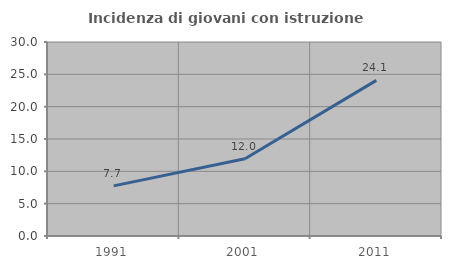
| Category | Incidenza di giovani con istruzione universitaria |
|---|---|
| 1991.0 | 7.75 |
| 2001.0 | 11.955 |
| 2011.0 | 24.065 |